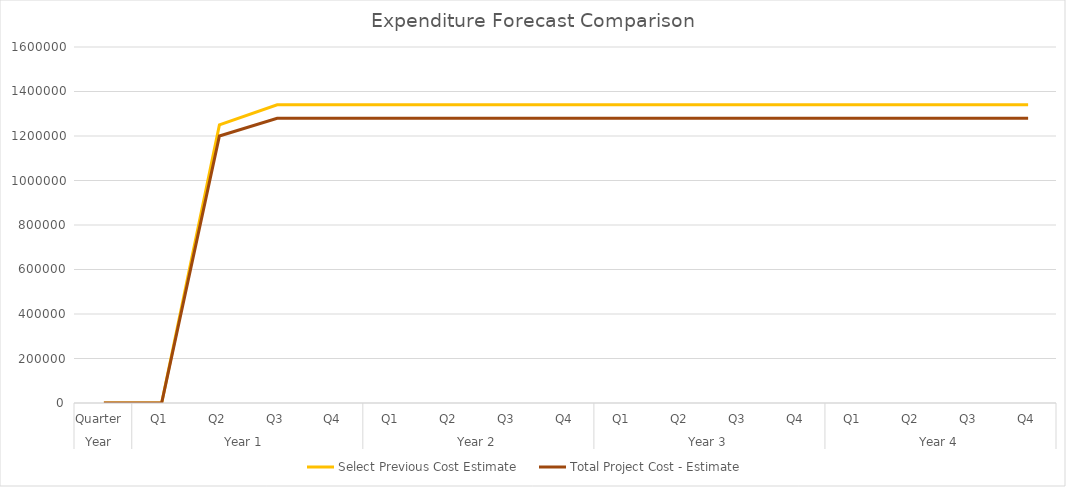
| Category | Select Previous Cost Estimate | Total Project Cost - Estimate |
|---|---|---|
| 0 | 0 | 0 |
| 1 | 0 | 0 |
| 2 | 1250000 | 1200000 |
| 3 | 1340196.9 | 1279932.29 |
| 4 | 1340196.9 | 1279932.29 |
| 5 | 1340196.9 | 1279932.29 |
| 6 | 1340196.9 | 1279932.29 |
| 7 | 1340196.9 | 1279932.29 |
| 8 | 1340196.9 | 1279932.29 |
| 9 | 1340196.9 | 1279932.29 |
| 10 | 1340196.9 | 1279932.29 |
| 11 | 1340196.9 | 1279932.29 |
| 12 | 1340196.9 | 1279932.29 |
| 13 | 1340196.9 | 1279932.29 |
| 14 | 1340196.9 | 1279932.29 |
| 15 | 1340196.9 | 1279932.29 |
| 16 | 1340196.9 | 1279932.29 |